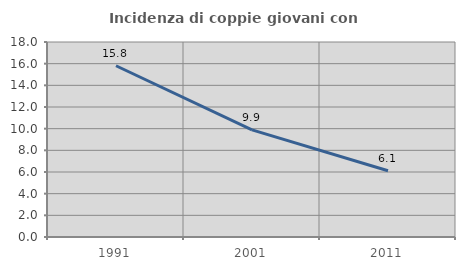
| Category | Incidenza di coppie giovani con figli |
|---|---|
| 1991.0 | 15.809 |
| 2001.0 | 9.886 |
| 2011.0 | 6.114 |